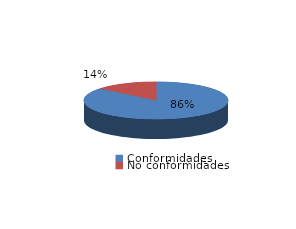
| Category | Series 0 |
|---|---|
| Conformidades | 2157 |
| No conformidades | 352 |